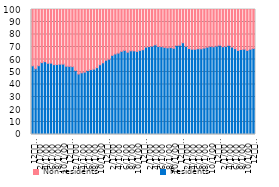
| Category | Residents | Non-residents  |
|---|---|---|
| 12
2013 | 54.939 | 45.061 |
| 1 | 52.632 | 47.368 |
| 2 | 55.024 | 44.976 |
| 3 | 57.529 | 42.471 |
| 4 | 58.275 | 41.725 |
| 5 | 56.994 | 43.006 |
| 6 | 57.079 | 42.921 |
| 7 | 55.908 | 44.092 |
| 8 | 55.99 | 44.01 |
| 9 | 56.259 | 43.741 |
| 10 | 56.316 | 43.684 |
| 11 | 54.626 | 45.374 |
| 12
2014 | 54.518 | 45.482 |
| 1 | 54.275 | 45.725 |
| 2 | 51.149 | 48.851 |
| 3 | 48.387 | 51.613 |
| 4 | 49.394 | 50.606 |
| 5 | 49.863 | 50.137 |
| 6 | 51.173 | 48.827 |
| 7 | 51.916 | 48.084 |
| 8 | 52.313 | 47.687 |
| 9 | 53.486 | 46.514 |
| 10 | 55.78 | 44.22 |
| 11 | 57.361 | 42.639 |
| 12
2015 | 59.38 | 40.62 |
| 1 | 60.252 | 39.748 |
| 2 | 63.321 | 36.679 |
| 3 | 64.419 | 35.581 |
| 4 | 65.102 | 34.898 |
| 5 | 66.515 | 33.485 |
| 6 | 67.33 | 32.67 |
| 7 | 65.846 | 34.154 |
| 8 | 66.966 | 33.034 |
| 9 | 66.935 | 33.065 |
| 10 | 66.482 | 33.518 |
| 11 | 67.293 | 32.707 |
| 12
2016 | 67.823 | 32.177 |
| 1 | 69.888 | 30.112 |
| 2 | 70.36 | 29.64 |
| 3 | 70.739 | 29.261 |
| 4 | 71.751 | 28.249 |
| 5 | 70.41 | 29.59 |
| 6 | 70.279 | 29.721 |
| 7 | 69.666 | 30.334 |
| 8 | 69.318 | 30.682 |
| 9 | 69.544 | 30.456 |
| 10 | 68.976 | 31.024 |
| 11 | 71.255 | 28.745 |
| 12
2017 | 71.404 | 28.596 |
| 1 | 73.407 | 26.593 |
| 2 | 70.601 | 29.399 |
| 3 | 68.779 | 31.221 |
| 4 | 68.22 | 31.78 |
| 5 | 68.185 | 31.815 |
| 6 | 68.639 | 31.361 |
| 7 | 68.533 | 31.467 |
| 8 | 69.133 | 30.867 |
| 9 | 69.84 | 30.16 |
| 10 | 70.47 | 29.53 |
| 11 | 70.173 | 29.827 |
| 12
2018 | 70.775 | 29.225 |
| 1 | 71.357 | 28.643 |
| 2 | 70.234 | 29.766 |
| 3 | 70.548 | 29.452 |
| 4 | 71.349 | 28.651 |
| 5 | 69.929 | 30.071 |
| 6 | 68.659 | 31.341 |
| 7 | 67.282 | 32.718 |
| 8 | 68.026 | 31.974 |
| 9 | 68.252 | 31.748 |
| 10 | 67.245 | 32.755 |
| 11 | 68.232 | 31.768 |
| 12
2019 | 68.829 | 31.171 |